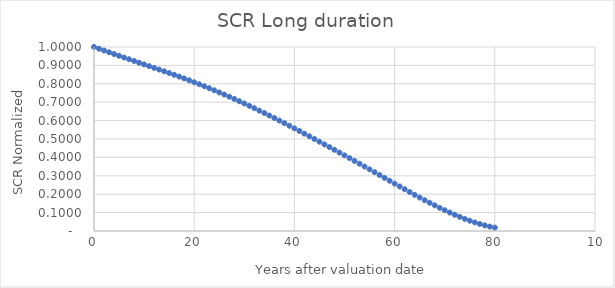
| Category | SCR Norm |
|---|---|
| 0.0 | 1 |
| 1.0 | 0.99 |
| 2.0 | 0.981 |
| 3.0 | 0.971 |
| 4.0 | 0.962 |
| 5.0 | 0.952 |
| 6.0 | 0.943 |
| 7.0 | 0.933 |
| 8.0 | 0.924 |
| 9.0 | 0.914 |
| 10.0 | 0.905 |
| 11.0 | 0.896 |
| 12.0 | 0.887 |
| 13.0 | 0.877 |
| 14.0 | 0.868 |
| 15.0 | 0.858 |
| 16.0 | 0.849 |
| 17.0 | 0.839 |
| 18.0 | 0.829 |
| 19.0 | 0.819 |
| 20.0 | 0.808 |
| 21.0 | 0.798 |
| 22.0 | 0.787 |
| 23.0 | 0.776 |
| 24.0 | 0.765 |
| 25.0 | 0.753 |
| 26.0 | 0.742 |
| 27.0 | 0.73 |
| 28.0 | 0.718 |
| 29.0 | 0.705 |
| 30.0 | 0.693 |
| 31.0 | 0.68 |
| 32.0 | 0.667 |
| 33.0 | 0.654 |
| 34.0 | 0.641 |
| 35.0 | 0.628 |
| 36.0 | 0.614 |
| 37.0 | 0.6 |
| 38.0 | 0.586 |
| 39.0 | 0.572 |
| 40.0 | 0.558 |
| 41.0 | 0.543 |
| 42.0 | 0.529 |
| 43.0 | 0.515 |
| 44.0 | 0.5 |
| 45.0 | 0.485 |
| 46.0 | 0.471 |
| 47.0 | 0.456 |
| 48.0 | 0.441 |
| 49.0 | 0.426 |
| 50.0 | 0.411 |
| 51.0 | 0.396 |
| 52.0 | 0.381 |
| 53.0 | 0.366 |
| 54.0 | 0.35 |
| 55.0 | 0.335 |
| 56.0 | 0.32 |
| 57.0 | 0.304 |
| 58.0 | 0.289 |
| 59.0 | 0.273 |
| 60.0 | 0.258 |
| 61.0 | 0.242 |
| 62.0 | 0.227 |
| 63.0 | 0.212 |
| 64.0 | 0.197 |
| 65.0 | 0.182 |
| 66.0 | 0.168 |
| 67.0 | 0.153 |
| 68.0 | 0.139 |
| 69.0 | 0.126 |
| 70.0 | 0.113 |
| 71.0 | 0.1 |
| 72.0 | 0.088 |
| 73.0 | 0.077 |
| 74.0 | 0.066 |
| 75.0 | 0.056 |
| 76.0 | 0.047 |
| 77.0 | 0.038 |
| 78.0 | 0.031 |
| 79.0 | 0.024 |
| 80.0 | 0.018 |